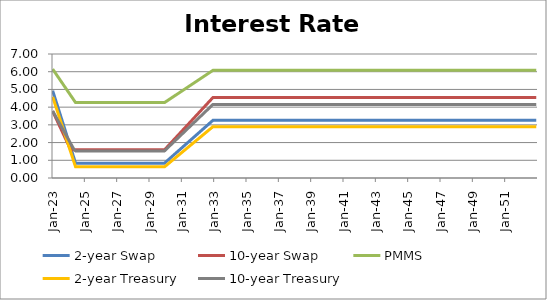
| Category | 2-year Swap | 10-year Swap | PMMS | 2-year Treasury | 10-year Treasury |
|---|---|---|---|---|---|
| 2023-01-31 | 4.927 | 3.771 | 6.149 | 4.578 | 3.783 |
| 2023-02-28 | 4.686 | 3.608 | 6.037 | 4.345 | 3.646 |
| 2023-03-31 | 4.445 | 3.446 | 5.926 | 4.113 | 3.509 |
| 2023-04-30 | 4.205 | 3.283 | 5.815 | 3.881 | 3.371 |
| 2023-05-31 | 3.964 | 3.12 | 5.704 | 3.648 | 3.234 |
| 2023-06-30 | 3.724 | 2.958 | 5.592 | 3.416 | 3.097 |
| 2023-07-31 | 3.483 | 2.795 | 5.481 | 3.184 | 2.96 |
| 2023-08-31 | 3.243 | 2.632 | 5.37 | 2.952 | 2.823 |
| 2023-09-30 | 3.002 | 2.47 | 5.259 | 2.719 | 2.686 |
| 2023-10-31 | 2.762 | 2.307 | 5.147 | 2.487 | 2.549 |
| 2023-11-30 | 2.521 | 2.144 | 5.036 | 2.255 | 2.412 |
| 2023-12-31 | 2.281 | 1.982 | 4.925 | 2.022 | 2.274 |
| 2024-01-31 | 2.04 | 1.819 | 4.813 | 1.79 | 2.137 |
| 2024-02-29 | 1.799 | 1.656 | 4.702 | 1.558 | 2 |
| 2024-03-31 | 1.559 | 1.589 | 4.591 | 1.325 | 1.863 |
| 2024-04-30 | 1.318 | 1.589 | 4.48 | 1.093 | 1.726 |
| 2024-05-31 | 1.078 | 1.589 | 4.368 | 0.861 | 1.589 |
| 2024-06-30 | 0.837 | 1.589 | 4.257 | 0.628 | 1.53 |
| 2024-07-31 | 0.837 | 1.589 | 4.257 | 0.628 | 1.53 |
| 2024-08-31 | 0.837 | 1.589 | 4.257 | 0.628 | 1.53 |
| 2024-09-30 | 0.837 | 1.589 | 4.257 | 0.628 | 1.53 |
| 2024-10-31 | 0.837 | 1.589 | 4.257 | 0.628 | 1.53 |
| 2024-11-30 | 0.837 | 1.589 | 4.257 | 0.628 | 1.53 |
| 2024-12-31 | 0.837 | 1.589 | 4.257 | 0.628 | 1.53 |
| 2025-01-31 | 0.837 | 1.589 | 4.257 | 0.628 | 1.53 |
| 2025-02-28 | 0.837 | 1.589 | 4.257 | 0.628 | 1.53 |
| 2025-03-31 | 0.837 | 1.589 | 4.257 | 0.628 | 1.53 |
| 2025-04-30 | 0.837 | 1.589 | 4.257 | 0.628 | 1.53 |
| 2025-05-31 | 0.837 | 1.589 | 4.257 | 0.628 | 1.53 |
| 2025-06-30 | 0.837 | 1.589 | 4.257 | 0.628 | 1.53 |
| 2025-07-31 | 0.837 | 1.589 | 4.257 | 0.628 | 1.53 |
| 2025-08-31 | 0.837 | 1.589 | 4.257 | 0.628 | 1.53 |
| 2025-09-30 | 0.837 | 1.589 | 4.257 | 0.628 | 1.53 |
| 2025-10-31 | 0.837 | 1.589 | 4.257 | 0.628 | 1.53 |
| 2025-11-30 | 0.837 | 1.589 | 4.257 | 0.628 | 1.53 |
| 2025-12-31 | 0.837 | 1.589 | 4.257 | 0.628 | 1.53 |
| 2026-01-31 | 0.837 | 1.589 | 4.257 | 0.628 | 1.53 |
| 2026-02-28 | 0.837 | 1.589 | 4.257 | 0.628 | 1.53 |
| 2026-03-31 | 0.837 | 1.589 | 4.257 | 0.628 | 1.53 |
| 2026-04-30 | 0.837 | 1.589 | 4.257 | 0.628 | 1.53 |
| 2026-05-31 | 0.837 | 1.589 | 4.257 | 0.628 | 1.53 |
| 2026-06-30 | 0.837 | 1.589 | 4.257 | 0.628 | 1.53 |
| 2026-07-31 | 0.837 | 1.589 | 4.257 | 0.628 | 1.53 |
| 2026-08-31 | 0.837 | 1.589 | 4.257 | 0.628 | 1.53 |
| 2026-09-30 | 0.837 | 1.589 | 4.257 | 0.628 | 1.53 |
| 2026-10-31 | 0.837 | 1.589 | 4.257 | 0.628 | 1.53 |
| 2026-11-30 | 0.837 | 1.589 | 4.257 | 0.628 | 1.53 |
| 2026-12-31 | 0.837 | 1.589 | 4.257 | 0.628 | 1.53 |
| 2027-01-31 | 0.837 | 1.589 | 4.257 | 0.628 | 1.53 |
| 2027-02-28 | 0.837 | 1.589 | 4.257 | 0.628 | 1.53 |
| 2027-03-31 | 0.837 | 1.589 | 4.257 | 0.628 | 1.53 |
| 2027-04-30 | 0.837 | 1.589 | 4.257 | 0.628 | 1.53 |
| 2027-05-31 | 0.837 | 1.589 | 4.257 | 0.628 | 1.53 |
| 2027-06-30 | 0.837 | 1.589 | 4.257 | 0.628 | 1.53 |
| 2027-07-31 | 0.837 | 1.589 | 4.257 | 0.628 | 1.53 |
| 2027-08-31 | 0.837 | 1.589 | 4.257 | 0.628 | 1.53 |
| 2027-09-30 | 0.837 | 1.589 | 4.257 | 0.628 | 1.53 |
| 2027-10-31 | 0.837 | 1.589 | 4.257 | 0.628 | 1.53 |
| 2027-11-30 | 0.837 | 1.589 | 4.257 | 0.628 | 1.53 |
| 2027-12-31 | 0.837 | 1.589 | 4.257 | 0.628 | 1.53 |
| 2028-01-31 | 0.837 | 1.589 | 4.257 | 0.628 | 1.53 |
| 2028-02-29 | 0.837 | 1.589 | 4.257 | 0.628 | 1.53 |
| 2028-03-31 | 0.837 | 1.589 | 4.257 | 0.628 | 1.53 |
| 2028-04-30 | 0.837 | 1.589 | 4.257 | 0.628 | 1.53 |
| 2028-05-31 | 0.837 | 1.589 | 4.257 | 0.628 | 1.53 |
| 2028-06-30 | 0.837 | 1.589 | 4.257 | 0.628 | 1.53 |
| 2028-07-31 | 0.837 | 1.589 | 4.257 | 0.628 | 1.53 |
| 2028-08-31 | 0.837 | 1.589 | 4.257 | 0.628 | 1.53 |
| 2028-09-30 | 0.837 | 1.589 | 4.257 | 0.628 | 1.53 |
| 2028-10-31 | 0.837 | 1.589 | 4.257 | 0.628 | 1.53 |
| 2028-11-30 | 0.837 | 1.589 | 4.257 | 0.628 | 1.53 |
| 2028-12-31 | 0.837 | 1.589 | 4.257 | 0.628 | 1.53 |
| 2029-01-31 | 0.837 | 1.589 | 4.257 | 0.628 | 1.53 |
| 2029-02-28 | 0.837 | 1.589 | 4.257 | 0.628 | 1.53 |
| 2029-03-31 | 0.837 | 1.589 | 4.257 | 0.628 | 1.53 |
| 2029-04-30 | 0.837 | 1.589 | 4.257 | 0.628 | 1.53 |
| 2029-05-31 | 0.837 | 1.589 | 4.257 | 0.628 | 1.53 |
| 2029-06-30 | 0.837 | 1.589 | 4.257 | 0.628 | 1.53 |
| 2029-07-31 | 0.837 | 1.589 | 4.257 | 0.628 | 1.53 |
| 2029-08-31 | 0.837 | 1.589 | 4.257 | 0.628 | 1.53 |
| 2029-09-30 | 0.837 | 1.589 | 4.257 | 0.628 | 1.53 |
| 2029-10-31 | 0.837 | 1.589 | 4.257 | 0.628 | 1.53 |
| 2029-11-30 | 0.837 | 1.589 | 4.257 | 0.628 | 1.53 |
| 2029-12-31 | 0.837 | 1.589 | 4.257 | 0.628 | 1.53 |
| 2030-01-31 | 0.905 | 1.671 | 4.308 | 0.691 | 1.603 |
| 2030-02-28 | 0.972 | 1.753 | 4.358 | 0.755 | 1.676 |
| 2030-03-31 | 1.039 | 1.835 | 4.409 | 0.818 | 1.749 |
| 2030-04-30 | 1.106 | 1.918 | 4.46 | 0.881 | 1.822 |
| 2030-05-31 | 1.174 | 2 | 4.51 | 0.944 | 1.895 |
| 2030-06-30 | 1.241 | 2.082 | 4.561 | 1.007 | 1.968 |
| 2030-07-31 | 1.308 | 2.164 | 4.611 | 1.07 | 2.04 |
| 2030-08-31 | 1.376 | 2.246 | 4.662 | 1.133 | 2.113 |
| 2030-09-30 | 1.443 | 2.328 | 4.713 | 1.196 | 2.186 |
| 2030-10-31 | 1.51 | 2.41 | 4.763 | 1.259 | 2.259 |
| 2030-11-30 | 1.577 | 2.493 | 4.814 | 1.323 | 2.332 |
| 2030-12-31 | 1.645 | 2.575 | 4.864 | 1.386 | 2.405 |
| 2031-01-31 | 1.712 | 2.657 | 4.915 | 1.449 | 2.478 |
| 2031-02-28 | 1.779 | 2.739 | 4.966 | 1.512 | 2.551 |
| 2031-03-31 | 1.846 | 2.821 | 5.016 | 1.575 | 2.624 |
| 2031-04-30 | 1.914 | 2.903 | 5.067 | 1.638 | 2.697 |
| 2031-05-31 | 1.981 | 2.985 | 5.117 | 1.701 | 2.77 |
| 2031-06-30 | 2.048 | 3.067 | 5.168 | 1.764 | 2.843 |
| 2031-07-31 | 2.116 | 3.15 | 5.219 | 1.827 | 2.915 |
| 2031-08-31 | 2.183 | 3.232 | 5.269 | 1.89 | 2.988 |
| 2031-09-30 | 2.25 | 3.314 | 5.32 | 1.954 | 3.061 |
| 2031-10-31 | 2.317 | 3.396 | 5.371 | 2.017 | 3.134 |
| 2031-11-30 | 2.385 | 3.478 | 5.421 | 2.08 | 3.207 |
| 2031-12-31 | 2.452 | 3.56 | 5.472 | 2.143 | 3.28 |
| 2032-01-31 | 2.519 | 3.642 | 5.522 | 2.206 | 3.353 |
| 2032-02-29 | 2.587 | 3.725 | 5.573 | 2.269 | 3.426 |
| 2032-03-31 | 2.654 | 3.807 | 5.624 | 2.332 | 3.499 |
| 2032-04-30 | 2.721 | 3.889 | 5.674 | 2.395 | 3.572 |
| 2032-05-31 | 2.788 | 3.971 | 5.725 | 2.458 | 3.645 |
| 2032-06-30 | 2.856 | 4.053 | 5.775 | 2.521 | 3.718 |
| 2032-07-31 | 2.923 | 4.135 | 5.826 | 2.585 | 3.79 |
| 2032-08-31 | 2.99 | 4.217 | 5.877 | 2.648 | 3.863 |
| 2032-09-30 | 3.058 | 4.3 | 5.927 | 2.711 | 3.936 |
| 2032-10-31 | 3.125 | 4.382 | 5.978 | 2.774 | 4.009 |
| 2032-11-30 | 3.192 | 4.464 | 6.028 | 2.837 | 4.082 |
| 2032-12-31 | 3.259 | 4.546 | 6.079 | 2.9 | 4.155 |
| 2033-01-31 | 3.259 | 4.546 | 6.079 | 2.9 | 4.155 |
| 2033-02-28 | 3.259 | 4.546 | 6.079 | 2.9 | 4.155 |
| 2033-03-31 | 3.259 | 4.546 | 6.079 | 2.9 | 4.155 |
| 2033-04-30 | 3.259 | 4.546 | 6.079 | 2.9 | 4.155 |
| 2033-05-31 | 3.259 | 4.546 | 6.079 | 2.9 | 4.155 |
| 2033-06-30 | 3.259 | 4.546 | 6.079 | 2.9 | 4.155 |
| 2033-07-31 | 3.259 | 4.546 | 6.079 | 2.9 | 4.155 |
| 2033-08-31 | 3.259 | 4.546 | 6.079 | 2.9 | 4.155 |
| 2033-09-30 | 3.259 | 4.546 | 6.079 | 2.9 | 4.155 |
| 2033-10-31 | 3.259 | 4.546 | 6.079 | 2.9 | 4.155 |
| 2033-11-30 | 3.259 | 4.546 | 6.079 | 2.9 | 4.155 |
| 2033-12-31 | 3.259 | 4.546 | 6.079 | 2.9 | 4.155 |
| 2034-01-31 | 3.259 | 4.546 | 6.079 | 2.9 | 4.155 |
| 2034-02-28 | 3.259 | 4.546 | 6.079 | 2.9 | 4.155 |
| 2034-03-31 | 3.259 | 4.546 | 6.079 | 2.9 | 4.155 |
| 2034-04-30 | 3.259 | 4.546 | 6.079 | 2.9 | 4.155 |
| 2034-05-31 | 3.259 | 4.546 | 6.079 | 2.9 | 4.155 |
| 2034-06-30 | 3.259 | 4.546 | 6.079 | 2.9 | 4.155 |
| 2034-07-31 | 3.259 | 4.546 | 6.079 | 2.9 | 4.155 |
| 2034-08-31 | 3.259 | 4.546 | 6.079 | 2.9 | 4.155 |
| 2034-09-30 | 3.259 | 4.546 | 6.079 | 2.9 | 4.155 |
| 2034-10-31 | 3.259 | 4.546 | 6.079 | 2.9 | 4.155 |
| 2034-11-30 | 3.259 | 4.546 | 6.079 | 2.9 | 4.155 |
| 2034-12-31 | 3.259 | 4.546 | 6.079 | 2.9 | 4.155 |
| 2035-01-31 | 3.259 | 4.546 | 6.079 | 2.9 | 4.155 |
| 2035-02-28 | 3.259 | 4.546 | 6.079 | 2.9 | 4.155 |
| 2035-03-31 | 3.259 | 4.546 | 6.079 | 2.9 | 4.155 |
| 2035-04-30 | 3.259 | 4.546 | 6.079 | 2.9 | 4.155 |
| 2035-05-31 | 3.259 | 4.546 | 6.079 | 2.9 | 4.155 |
| 2035-06-30 | 3.259 | 4.546 | 6.079 | 2.9 | 4.155 |
| 2035-07-31 | 3.259 | 4.546 | 6.079 | 2.9 | 4.155 |
| 2035-08-31 | 3.259 | 4.546 | 6.079 | 2.9 | 4.155 |
| 2035-09-30 | 3.259 | 4.546 | 6.079 | 2.9 | 4.155 |
| 2035-10-31 | 3.259 | 4.546 | 6.079 | 2.9 | 4.155 |
| 2035-11-30 | 3.259 | 4.546 | 6.079 | 2.9 | 4.155 |
| 2035-12-31 | 3.259 | 4.546 | 6.079 | 2.9 | 4.155 |
| 2036-01-31 | 3.259 | 4.546 | 6.079 | 2.9 | 4.155 |
| 2036-02-29 | 3.259 | 4.546 | 6.079 | 2.9 | 4.155 |
| 2036-03-31 | 3.259 | 4.546 | 6.079 | 2.9 | 4.155 |
| 2036-04-30 | 3.259 | 4.546 | 6.079 | 2.9 | 4.155 |
| 2036-05-31 | 3.259 | 4.546 | 6.079 | 2.9 | 4.155 |
| 2036-06-30 | 3.259 | 4.546 | 6.079 | 2.9 | 4.155 |
| 2036-07-31 | 3.259 | 4.546 | 6.079 | 2.9 | 4.155 |
| 2036-08-31 | 3.259 | 4.546 | 6.079 | 2.9 | 4.155 |
| 2036-09-30 | 3.259 | 4.546 | 6.079 | 2.9 | 4.155 |
| 2036-10-31 | 3.259 | 4.546 | 6.079 | 2.9 | 4.155 |
| 2036-11-30 | 3.259 | 4.546 | 6.079 | 2.9 | 4.155 |
| 2036-12-31 | 3.259 | 4.546 | 6.079 | 2.9 | 4.155 |
| 2037-01-31 | 3.259 | 4.546 | 6.079 | 2.9 | 4.155 |
| 2037-02-28 | 3.259 | 4.546 | 6.079 | 2.9 | 4.155 |
| 2037-03-31 | 3.259 | 4.546 | 6.079 | 2.9 | 4.155 |
| 2037-04-30 | 3.259 | 4.546 | 6.079 | 2.9 | 4.155 |
| 2037-05-31 | 3.259 | 4.546 | 6.079 | 2.9 | 4.155 |
| 2037-06-30 | 3.259 | 4.546 | 6.079 | 2.9 | 4.155 |
| 2037-07-31 | 3.259 | 4.546 | 6.079 | 2.9 | 4.155 |
| 2037-08-31 | 3.259 | 4.546 | 6.079 | 2.9 | 4.155 |
| 2037-09-30 | 3.259 | 4.546 | 6.079 | 2.9 | 4.155 |
| 2037-10-31 | 3.259 | 4.546 | 6.079 | 2.9 | 4.155 |
| 2037-11-30 | 3.259 | 4.546 | 6.079 | 2.9 | 4.155 |
| 2037-12-31 | 3.259 | 4.546 | 6.079 | 2.9 | 4.155 |
| 2038-01-31 | 3.259 | 4.546 | 6.079 | 2.9 | 4.155 |
| 2038-02-28 | 3.259 | 4.546 | 6.079 | 2.9 | 4.155 |
| 2038-03-31 | 3.259 | 4.546 | 6.079 | 2.9 | 4.155 |
| 2038-04-30 | 3.259 | 4.546 | 6.079 | 2.9 | 4.155 |
| 2038-05-31 | 3.259 | 4.546 | 6.079 | 2.9 | 4.155 |
| 2038-06-30 | 3.259 | 4.546 | 6.079 | 2.9 | 4.155 |
| 2038-07-31 | 3.259 | 4.546 | 6.079 | 2.9 | 4.155 |
| 2038-08-31 | 3.259 | 4.546 | 6.079 | 2.9 | 4.155 |
| 2038-09-30 | 3.259 | 4.546 | 6.079 | 2.9 | 4.155 |
| 2038-10-31 | 3.259 | 4.546 | 6.079 | 2.9 | 4.155 |
| 2038-11-30 | 3.259 | 4.546 | 6.079 | 2.9 | 4.155 |
| 2038-12-31 | 3.259 | 4.546 | 6.079 | 2.9 | 4.155 |
| 2039-01-31 | 3.259 | 4.546 | 6.079 | 2.9 | 4.155 |
| 2039-02-28 | 3.259 | 4.546 | 6.079 | 2.9 | 4.155 |
| 2039-03-31 | 3.259 | 4.546 | 6.079 | 2.9 | 4.155 |
| 2039-04-30 | 3.259 | 4.546 | 6.079 | 2.9 | 4.155 |
| 2039-05-31 | 3.259 | 4.546 | 6.079 | 2.9 | 4.155 |
| 2039-06-30 | 3.259 | 4.546 | 6.079 | 2.9 | 4.155 |
| 2039-07-31 | 3.259 | 4.546 | 6.079 | 2.9 | 4.155 |
| 2039-08-31 | 3.259 | 4.546 | 6.079 | 2.9 | 4.155 |
| 2039-09-30 | 3.259 | 4.546 | 6.079 | 2.9 | 4.155 |
| 2039-10-31 | 3.259 | 4.546 | 6.079 | 2.9 | 4.155 |
| 2039-11-30 | 3.259 | 4.546 | 6.079 | 2.9 | 4.155 |
| 2039-12-31 | 3.259 | 4.546 | 6.079 | 2.9 | 4.155 |
| 2040-01-31 | 3.259 | 4.546 | 6.079 | 2.9 | 4.155 |
| 2040-02-29 | 3.259 | 4.546 | 6.079 | 2.9 | 4.155 |
| 2040-03-31 | 3.259 | 4.546 | 6.079 | 2.9 | 4.155 |
| 2040-04-30 | 3.259 | 4.546 | 6.079 | 2.9 | 4.155 |
| 2040-05-31 | 3.259 | 4.546 | 6.079 | 2.9 | 4.155 |
| 2040-06-30 | 3.259 | 4.546 | 6.079 | 2.9 | 4.155 |
| 2040-07-31 | 3.259 | 4.546 | 6.079 | 2.9 | 4.155 |
| 2040-08-31 | 3.259 | 4.546 | 6.079 | 2.9 | 4.155 |
| 2040-09-30 | 3.259 | 4.546 | 6.079 | 2.9 | 4.155 |
| 2040-10-31 | 3.259 | 4.546 | 6.079 | 2.9 | 4.155 |
| 2040-11-30 | 3.259 | 4.546 | 6.079 | 2.9 | 4.155 |
| 2040-12-31 | 3.259 | 4.546 | 6.079 | 2.9 | 4.155 |
| 2041-01-31 | 3.259 | 4.546 | 6.079 | 2.9 | 4.155 |
| 2041-02-28 | 3.259 | 4.546 | 6.079 | 2.9 | 4.155 |
| 2041-03-31 | 3.259 | 4.546 | 6.079 | 2.9 | 4.155 |
| 2041-04-30 | 3.259 | 4.546 | 6.079 | 2.9 | 4.155 |
| 2041-05-31 | 3.259 | 4.546 | 6.079 | 2.9 | 4.155 |
| 2041-06-30 | 3.259 | 4.546 | 6.079 | 2.9 | 4.155 |
| 2041-07-31 | 3.259 | 4.546 | 6.079 | 2.9 | 4.155 |
| 2041-08-31 | 3.259 | 4.546 | 6.079 | 2.9 | 4.155 |
| 2041-09-30 | 3.259 | 4.546 | 6.079 | 2.9 | 4.155 |
| 2041-10-31 | 3.259 | 4.546 | 6.079 | 2.9 | 4.155 |
| 2041-11-30 | 3.259 | 4.546 | 6.079 | 2.9 | 4.155 |
| 2041-12-31 | 3.259 | 4.546 | 6.079 | 2.9 | 4.155 |
| 2042-01-31 | 3.259 | 4.546 | 6.079 | 2.9 | 4.155 |
| 2042-02-28 | 3.259 | 4.546 | 6.079 | 2.9 | 4.155 |
| 2042-03-31 | 3.259 | 4.546 | 6.079 | 2.9 | 4.155 |
| 2042-04-30 | 3.259 | 4.546 | 6.079 | 2.9 | 4.155 |
| 2042-05-31 | 3.259 | 4.546 | 6.079 | 2.9 | 4.155 |
| 2042-06-30 | 3.259 | 4.546 | 6.079 | 2.9 | 4.155 |
| 2042-07-31 | 3.259 | 4.546 | 6.079 | 2.9 | 4.155 |
| 2042-08-31 | 3.259 | 4.546 | 6.079 | 2.9 | 4.155 |
| 2042-09-30 | 3.259 | 4.546 | 6.079 | 2.9 | 4.155 |
| 2042-10-31 | 3.259 | 4.546 | 6.079 | 2.9 | 4.155 |
| 2042-11-30 | 3.259 | 4.546 | 6.079 | 2.9 | 4.155 |
| 2042-12-31 | 3.259 | 4.546 | 6.079 | 2.9 | 4.155 |
| 2043-01-31 | 3.259 | 4.546 | 6.079 | 2.9 | 4.155 |
| 2043-02-28 | 3.259 | 4.546 | 6.079 | 2.9 | 4.155 |
| 2043-03-31 | 3.259 | 4.546 | 6.079 | 2.9 | 4.155 |
| 2043-04-30 | 3.259 | 4.546 | 6.079 | 2.9 | 4.155 |
| 2043-05-31 | 3.259 | 4.546 | 6.079 | 2.9 | 4.155 |
| 2043-06-30 | 3.259 | 4.546 | 6.079 | 2.9 | 4.155 |
| 2043-07-31 | 3.259 | 4.546 | 6.079 | 2.9 | 4.155 |
| 2043-08-31 | 3.259 | 4.546 | 6.079 | 2.9 | 4.155 |
| 2043-09-30 | 3.259 | 4.546 | 6.079 | 2.9 | 4.155 |
| 2043-10-31 | 3.259 | 4.546 | 6.079 | 2.9 | 4.155 |
| 2043-11-30 | 3.259 | 4.546 | 6.079 | 2.9 | 4.155 |
| 2043-12-31 | 3.259 | 4.546 | 6.079 | 2.9 | 4.155 |
| 2044-01-31 | 3.259 | 4.546 | 6.079 | 2.9 | 4.155 |
| 2044-02-29 | 3.259 | 4.546 | 6.079 | 2.9 | 4.155 |
| 2044-03-31 | 3.259 | 4.546 | 6.079 | 2.9 | 4.155 |
| 2044-04-30 | 3.259 | 4.546 | 6.079 | 2.9 | 4.155 |
| 2044-05-31 | 3.259 | 4.546 | 6.079 | 2.9 | 4.155 |
| 2044-06-30 | 3.259 | 4.546 | 6.079 | 2.9 | 4.155 |
| 2044-07-31 | 3.259 | 4.546 | 6.079 | 2.9 | 4.155 |
| 2044-08-31 | 3.259 | 4.546 | 6.079 | 2.9 | 4.155 |
| 2044-09-30 | 3.259 | 4.546 | 6.079 | 2.9 | 4.155 |
| 2044-10-31 | 3.259 | 4.546 | 6.079 | 2.9 | 4.155 |
| 2044-11-30 | 3.259 | 4.546 | 6.079 | 2.9 | 4.155 |
| 2044-12-31 | 3.259 | 4.546 | 6.079 | 2.9 | 4.155 |
| 2045-01-31 | 3.259 | 4.546 | 6.079 | 2.9 | 4.155 |
| 2045-02-28 | 3.259 | 4.546 | 6.079 | 2.9 | 4.155 |
| 2045-03-31 | 3.259 | 4.546 | 6.079 | 2.9 | 4.155 |
| 2045-04-30 | 3.259 | 4.546 | 6.079 | 2.9 | 4.155 |
| 2045-05-31 | 3.259 | 4.546 | 6.079 | 2.9 | 4.155 |
| 2045-06-30 | 3.259 | 4.546 | 6.079 | 2.9 | 4.155 |
| 2045-07-31 | 3.259 | 4.546 | 6.079 | 2.9 | 4.155 |
| 2045-08-31 | 3.259 | 4.546 | 6.079 | 2.9 | 4.155 |
| 2045-09-30 | 3.259 | 4.546 | 6.079 | 2.9 | 4.155 |
| 2045-10-31 | 3.259 | 4.546 | 6.079 | 2.9 | 4.155 |
| 2045-11-30 | 3.259 | 4.546 | 6.079 | 2.9 | 4.155 |
| 2045-12-31 | 3.259 | 4.546 | 6.079 | 2.9 | 4.155 |
| 2046-01-31 | 3.259 | 4.546 | 6.079 | 2.9 | 4.155 |
| 2046-02-28 | 3.259 | 4.546 | 6.079 | 2.9 | 4.155 |
| 2046-03-31 | 3.259 | 4.546 | 6.079 | 2.9 | 4.155 |
| 2046-04-30 | 3.259 | 4.546 | 6.079 | 2.9 | 4.155 |
| 2046-05-31 | 3.259 | 4.546 | 6.079 | 2.9 | 4.155 |
| 2046-06-30 | 3.259 | 4.546 | 6.079 | 2.9 | 4.155 |
| 2046-07-31 | 3.259 | 4.546 | 6.079 | 2.9 | 4.155 |
| 2046-08-31 | 3.259 | 4.546 | 6.079 | 2.9 | 4.155 |
| 2046-09-30 | 3.259 | 4.546 | 6.079 | 2.9 | 4.155 |
| 2046-10-31 | 3.259 | 4.546 | 6.079 | 2.9 | 4.155 |
| 2046-11-30 | 3.259 | 4.546 | 6.079 | 2.9 | 4.155 |
| 2046-12-31 | 3.259 | 4.546 | 6.079 | 2.9 | 4.155 |
| 2047-01-31 | 3.259 | 4.546 | 6.079 | 2.9 | 4.155 |
| 2047-02-28 | 3.259 | 4.546 | 6.079 | 2.9 | 4.155 |
| 2047-03-31 | 3.259 | 4.546 | 6.079 | 2.9 | 4.155 |
| 2047-04-30 | 3.259 | 4.546 | 6.079 | 2.9 | 4.155 |
| 2047-05-31 | 3.259 | 4.546 | 6.079 | 2.9 | 4.155 |
| 2047-06-30 | 3.259 | 4.546 | 6.079 | 2.9 | 4.155 |
| 2047-07-31 | 3.259 | 4.546 | 6.079 | 2.9 | 4.155 |
| 2047-08-31 | 3.259 | 4.546 | 6.079 | 2.9 | 4.155 |
| 2047-09-30 | 3.259 | 4.546 | 6.079 | 2.9 | 4.155 |
| 2047-10-31 | 3.259 | 4.546 | 6.079 | 2.9 | 4.155 |
| 2047-11-30 | 3.259 | 4.546 | 6.079 | 2.9 | 4.155 |
| 2047-12-31 | 3.259 | 4.546 | 6.079 | 2.9 | 4.155 |
| 2048-01-31 | 3.259 | 4.546 | 6.079 | 2.9 | 4.155 |
| 2048-02-29 | 3.259 | 4.546 | 6.079 | 2.9 | 4.155 |
| 2048-03-31 | 3.259 | 4.546 | 6.079 | 2.9 | 4.155 |
| 2048-04-30 | 3.259 | 4.546 | 6.079 | 2.9 | 4.155 |
| 2048-05-31 | 3.259 | 4.546 | 6.079 | 2.9 | 4.155 |
| 2048-06-30 | 3.259 | 4.546 | 6.079 | 2.9 | 4.155 |
| 2048-07-31 | 3.259 | 4.546 | 6.079 | 2.9 | 4.155 |
| 2048-08-31 | 3.259 | 4.546 | 6.079 | 2.9 | 4.155 |
| 2048-09-30 | 3.259 | 4.546 | 6.079 | 2.9 | 4.155 |
| 2048-10-31 | 3.259 | 4.546 | 6.079 | 2.9 | 4.155 |
| 2048-11-30 | 3.259 | 4.546 | 6.079 | 2.9 | 4.155 |
| 2048-12-31 | 3.259 | 4.546 | 6.079 | 2.9 | 4.155 |
| 2049-01-31 | 3.259 | 4.546 | 6.079 | 2.9 | 4.155 |
| 2049-02-28 | 3.259 | 4.546 | 6.079 | 2.9 | 4.155 |
| 2049-03-31 | 3.259 | 4.546 | 6.079 | 2.9 | 4.155 |
| 2049-04-30 | 3.259 | 4.546 | 6.079 | 2.9 | 4.155 |
| 2049-05-31 | 3.259 | 4.546 | 6.079 | 2.9 | 4.155 |
| 2049-06-30 | 3.259 | 4.546 | 6.079 | 2.9 | 4.155 |
| 2049-07-31 | 3.259 | 4.546 | 6.079 | 2.9 | 4.155 |
| 2049-08-31 | 3.259 | 4.546 | 6.079 | 2.9 | 4.155 |
| 2049-09-30 | 3.259 | 4.546 | 6.079 | 2.9 | 4.155 |
| 2049-10-31 | 3.259 | 4.546 | 6.079 | 2.9 | 4.155 |
| 2049-11-30 | 3.259 | 4.546 | 6.079 | 2.9 | 4.155 |
| 2049-12-31 | 3.259 | 4.546 | 6.079 | 2.9 | 4.155 |
| 2050-01-31 | 3.259 | 4.546 | 6.079 | 2.9 | 4.155 |
| 2050-02-28 | 3.259 | 4.546 | 6.079 | 2.9 | 4.155 |
| 2050-03-31 | 3.259 | 4.546 | 6.079 | 2.9 | 4.155 |
| 2050-04-30 | 3.259 | 4.546 | 6.079 | 2.9 | 4.155 |
| 2050-05-31 | 3.259 | 4.546 | 6.079 | 2.9 | 4.155 |
| 2050-06-30 | 3.259 | 4.546 | 6.079 | 2.9 | 4.155 |
| 2050-07-31 | 3.259 | 4.546 | 6.079 | 2.9 | 4.155 |
| 2050-08-31 | 3.259 | 4.546 | 6.079 | 2.9 | 4.155 |
| 2050-09-30 | 3.259 | 4.546 | 6.079 | 2.9 | 4.155 |
| 2050-10-31 | 3.259 | 4.546 | 6.079 | 2.9 | 4.155 |
| 2050-11-30 | 3.259 | 4.546 | 6.079 | 2.9 | 4.155 |
| 2050-12-31 | 3.259 | 4.546 | 6.079 | 2.9 | 4.155 |
| 2051-01-31 | 3.259 | 4.546 | 6.079 | 2.9 | 4.155 |
| 2051-02-28 | 3.259 | 4.546 | 6.079 | 2.9 | 4.155 |
| 2051-03-31 | 3.259 | 4.546 | 6.079 | 2.9 | 4.155 |
| 2051-04-30 | 3.259 | 4.546 | 6.079 | 2.9 | 4.155 |
| 2051-05-31 | 3.259 | 4.546 | 6.079 | 2.9 | 4.155 |
| 2051-06-30 | 3.259 | 4.546 | 6.079 | 2.9 | 4.155 |
| 2051-07-31 | 3.259 | 4.546 | 6.079 | 2.9 | 4.155 |
| 2051-08-31 | 3.259 | 4.546 | 6.079 | 2.9 | 4.155 |
| 2051-09-30 | 3.259 | 4.546 | 6.079 | 2.9 | 4.155 |
| 2051-10-31 | 3.259 | 4.546 | 6.079 | 2.9 | 4.155 |
| 2051-11-30 | 3.259 | 4.546 | 6.079 | 2.9 | 4.155 |
| 2051-12-31 | 3.259 | 4.546 | 6.079 | 2.9 | 4.155 |
| 2052-01-31 | 3.259 | 4.546 | 6.079 | 2.9 | 4.155 |
| 2052-02-29 | 3.259 | 4.546 | 6.079 | 2.9 | 4.155 |
| 2052-03-31 | 3.259 | 4.546 | 6.079 | 2.9 | 4.155 |
| 2052-04-30 | 3.259 | 4.546 | 6.079 | 2.9 | 4.155 |
| 2052-05-31 | 3.259 | 4.546 | 6.079 | 2.9 | 4.155 |
| 2052-06-30 | 3.259 | 4.546 | 6.079 | 2.9 | 4.155 |
| 2052-07-31 | 3.259 | 4.546 | 6.079 | 2.9 | 4.155 |
| 2052-08-31 | 3.259 | 4.546 | 6.079 | 2.9 | 4.155 |
| 2052-09-30 | 3.259 | 4.546 | 6.079 | 2.9 | 4.155 |
| 2052-10-31 | 3.259 | 4.546 | 6.079 | 2.9 | 4.155 |
| 2052-11-30 | 3.259 | 4.546 | 6.079 | 2.9 | 4.155 |
| 2052-12-31 | 3.259 | 4.546 | 6.079 | 2.9 | 4.155 |